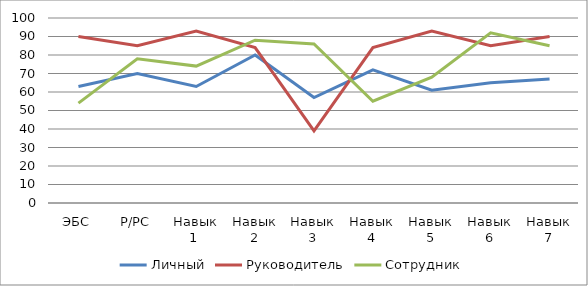
| Category | Личный | Руководитель | Сотрудник |
|---|---|---|---|
| ЭБС | 63 | 90 | 54 |
| Р/РС | 70 | 85 | 78 |
| Навык 1  | 63 | 93 | 74 |
| Навык 2 | 80 | 84 | 88 |
| Навык 3 | 57 | 39 | 86 |
| Навык 4 | 72 | 84 | 55 |
| Навык 5 | 61 | 93 | 68 |
| Навык 6 | 65 | 85 | 92 |
| Навык 7 | 67 | 90 | 85 |